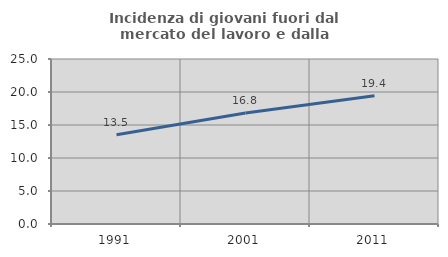
| Category | Incidenza di giovani fuori dal mercato del lavoro e dalla formazione  |
|---|---|
| 1991.0 | 13.534 |
| 2001.0 | 16.807 |
| 2011.0 | 19.444 |